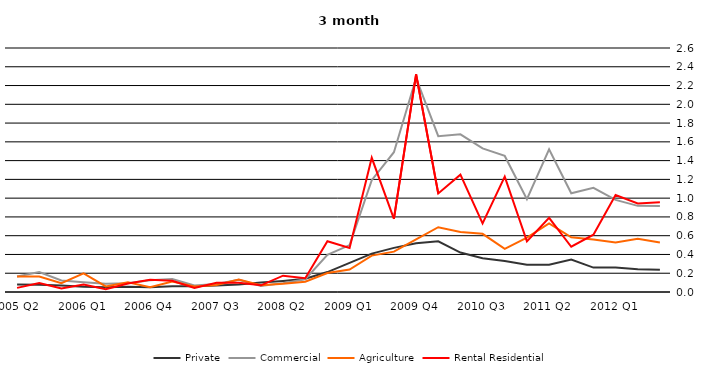
| Category | Private | Commercial | Agriculture | Rental Residential |
|---|---|---|---|---|
| 2005 Q2 | 0.081 | 0.166 | 0.165 | 0.044 |
| 2005 Q3 | 0.077 | 0.213 | 0.164 | 0.096 |
| 2005 Q4 | 0.07 | 0.122 | 0.094 | 0.036 |
| 2006 Q1 | 0.057 | 0.105 | 0.198 | 0.081 |
| 2006 Q2 | 0.051 | 0.088 | 0.059 | 0.031 |
| 2006 Q3 | 0.057 | 0.093 | 0.103 | 0.091 |
| 2006 Q4 | 0.05 | 0.126 | 0.052 | 0.131 |
| 2007 Q1 | 0.061 | 0.139 | 0.11 | 0.12 |
| 2007 Q2 | 0.062 | 0.07 | 0.06 | 0.043 |
| 2007 Q3 | 0.07 | 0.085 | 0.074 | 0.097 |
| 2007 Q4 | 0.081 | 0.131 | 0.133 | 0.098 |
| 2008 Q1 | 0.1 | 0.064 | 0.072 | 0.071 |
| 2008 Q2 | 0.118 | 0.094 | 0.089 | 0.174 |
| 2008 Q3 | 0.141 | 0.136 | 0.11 | 0.147 |
| 2008 Q4 | 0.212 | 0.397 | 0.202 | 0.541 |
| 2009 Q1 | 0.31 | 0.5 | 0.24 | 0.47 |
| 2009 Q2 | 0.409 | 1.192 | 0.387 | 1.43 |
| 2009 Q3 | 0.47 | 1.49 | 0.43 | 0.78 |
| 2009 Q4 | 0.52 | 2.28 | 0.56 | 2.32 |
| 2010 Q1 | 0.54 | 1.66 | 0.69 | 1.05 |
| 2010 Q2 | 0.42 | 1.68 | 0.64 | 1.25 |
| 2010 Q3 | 0.36 | 1.53 | 0.62 | 0.73 |
| 2010 Q4 | 0.33 | 1.45 | 0.46 | 1.23 |
| 2011 Q1 | 0.29 | 0.99 | 0.58 | 0.54 |
| 2011 Q2 | 0.29 | 1.52 | 0.73 | 0.79 |
| 2011 Q3 | 0.346 | 1.051 | 0.583 | 0.482 |
| 2011 Q4 | 0.26 | 1.11 | 0.56 | 0.61 |
| 2012 Q1 | 0.262 | 0.981 | 0.528 | 1.034 |
| 2012 Q2 | 0.243 | 0.918 | 0.568 | 0.944 |
| 2012 Q3 | 0.237 | 0.917 | 0.526 | 0.957 |